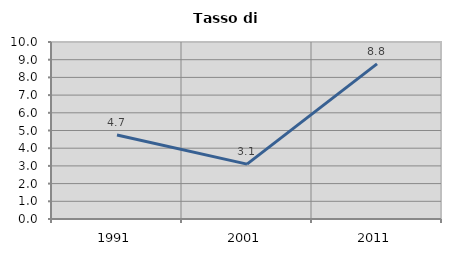
| Category | Tasso di disoccupazione   |
|---|---|
| 1991.0 | 4.744 |
| 2001.0 | 3.101 |
| 2011.0 | 8.764 |